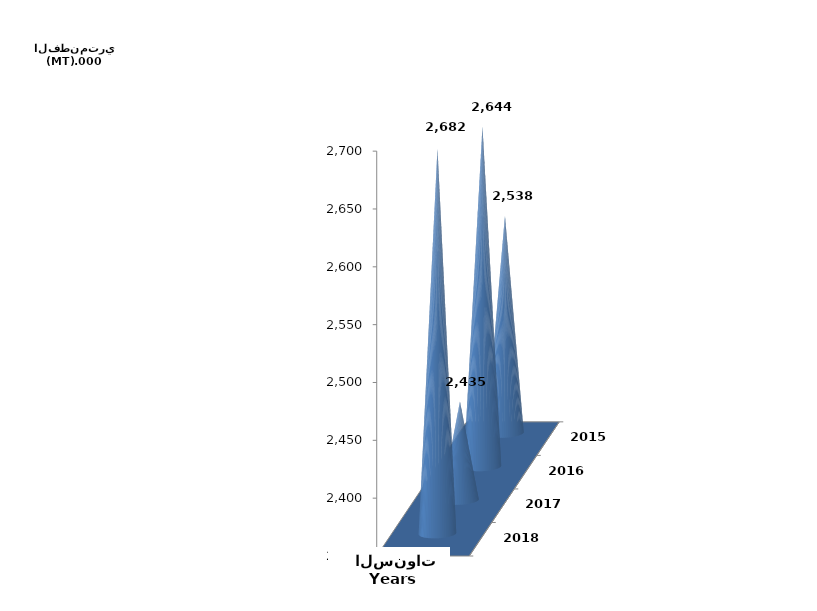
| Category | Series 0 | Series 1 |
|---|---|---|
| 2015 | 2537530 |  |
| 2016 | 2643727.953 |  |
| 2017 | 2435155.083 |  |
| 2018 | 2682336.913 |  |